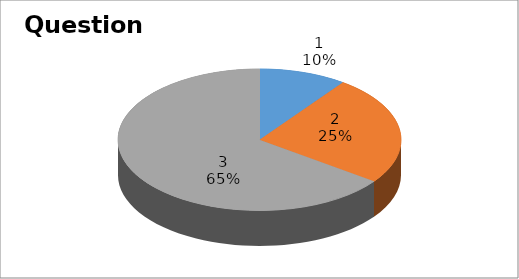
| Category | Series 0 |
|---|---|
| 0 | 2 |
| 1 | 5 |
| 2 | 13 |